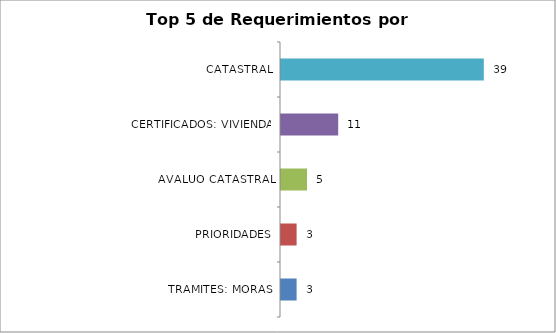
| Category | Total |
|---|---|
| TRAMITES: MORAS, PRIORIDADES | 3 |
| AVALUO CATASTRAL | 3 |
| CERTIFICADOS: VIVIENDA, CATASTRAL | 5 |
| ATENCION SERVIDORES RED CADE | 11 |
| ATENCION Y SERVICIO A LA CIUDADANIA | 39 |